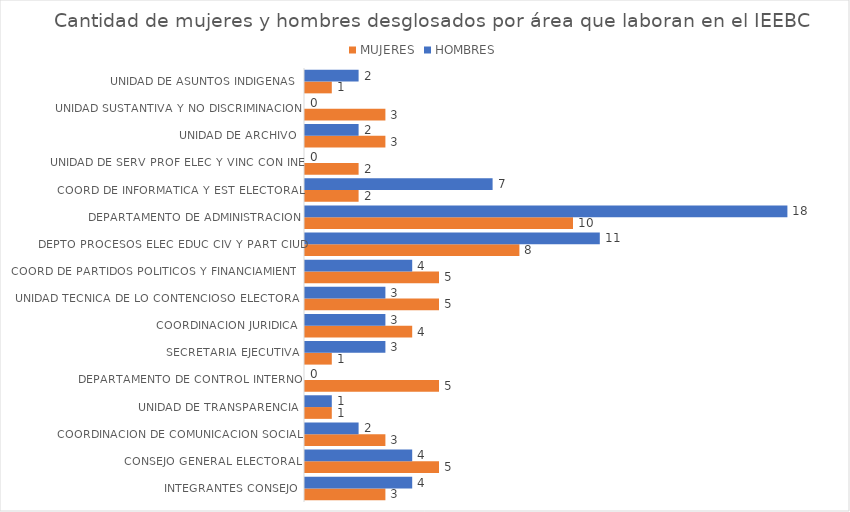
| Category | MUJERES | HOMBRES |
|---|---|---|
| INTEGRANTES CONSEJO | 3 | 4 |
| CONSEJO GENERAL ELECTORAL | 5 | 4 |
| COORDINACION DE COMUNICACION SOCIAL | 3 | 2 |
| UNIDAD DE TRANSPARENCIA | 1 | 1 |
| DEPARTAMENTO DE CONTROL INTERNO | 5 | 0 |
| SECRETARIA EJECUTIVA | 1 | 3 |
| COORDINACION JURIDICA | 4 | 3 |
| UNIDAD TECNICA DE LO CONTENCIOSO ELECTORAL | 5 | 3 |
| COORD DE PARTIDOS POLITICOS Y FINANCIAMIENTO | 5 | 4 |
| DEPTO PROCESOS ELEC EDUC CIV Y PART CIUD | 8 | 11 |
| DEPARTAMENTO DE ADMINISTRACION | 10 | 18 |
| COORD DE INFORMATICA Y EST ELECTORAL | 2 | 7 |
| UNIDAD DE SERV PROF ELEC Y VINC CON INE | 2 | 0 |
| UNIDAD DE ARCHIVO | 3 | 2 |
| UNIDAD SUSTANTIVA Y NO DISCRIMINACION | 3 | 0 |
| UNIDAD DE ASUNTOS INDIGENAS  | 1 | 2 |